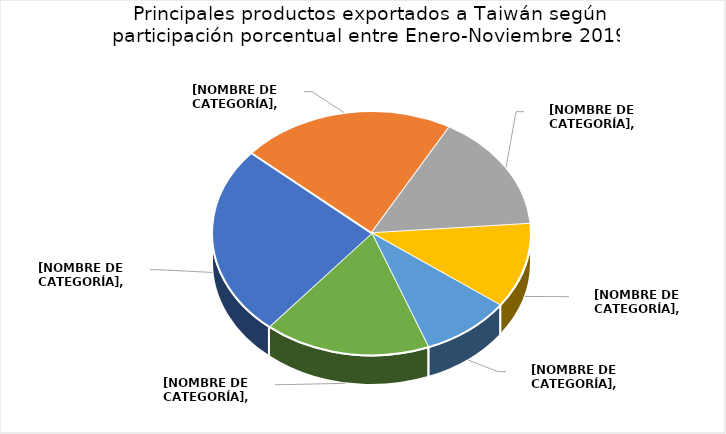
| Category | Series 0 |
|---|---|
| Carne de animales de la especie bovina, deshuesada, congelada. | 0.253 |
| Café tostado, descafeinado | 0.218 |
| Camarones y langostinos, de agua fría, congelados, excepto ahumados. | 0.156 |
| Desperdicios y desechos, de fundición, de hierro o acero. | 0.113 |
| Desperdicios y desechos, de aluminio | 0.091 |
| 18 productos restantes | 0.169 |